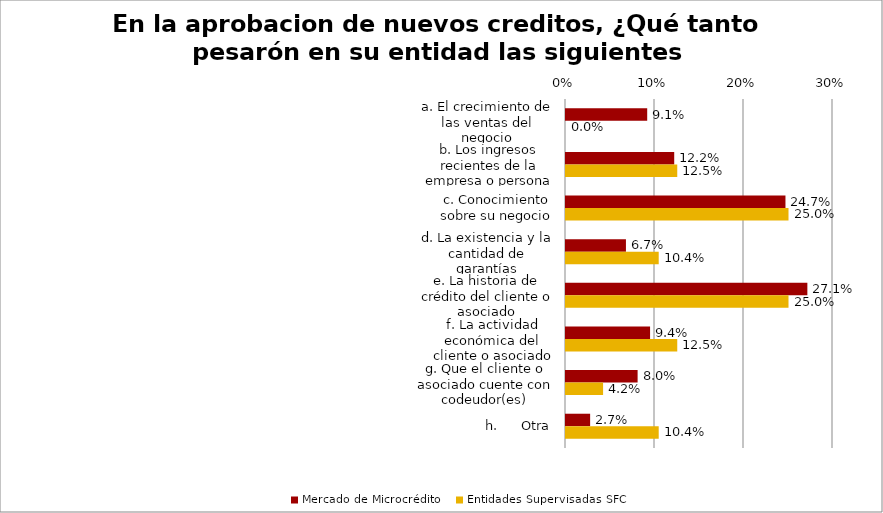
| Category | Mercado de Microcrédito | Entidades Supervisadas SFC |
|---|---|---|
| a. El crecimiento de las ventas del negocio | 0.091 | 0 |
| b. Los ingresos recientes de la empresa o persona natural | 0.122 | 0.125 |
| c. Conocimiento sobre su negocio | 0.247 | 0.25 |
| d. La existencia y la cantidad de garantías | 0.067 | 0.104 |
| e. La historia de crédito del cliente o asociado | 0.271 | 0.25 |
| f. La actividad económica del cliente o asociado | 0.094 | 0.125 |
| g. Que el cliente o asociado cuente con codeudor(es) | 0.08 | 0.042 |
| h.      Otra | 0.027 | 0.104 |